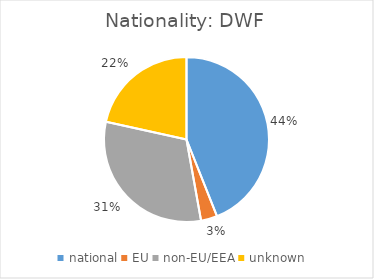
| Category | Nationality |
|---|---|
| national | 0.44 |
| EU | 0.032 |
| non-EU/EEA | 0.313 |
| unknown | 0.216 |